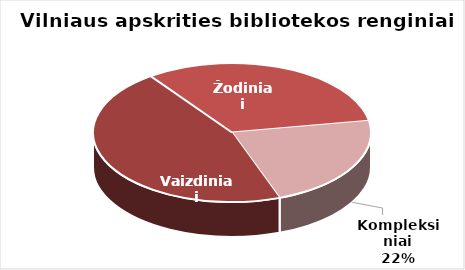
| Category | Series 0 |
|---|---|
| Vaizdiniai | 3271 |
| Žodiniai | 2312 |
| Kompleksiniai | 1590 |